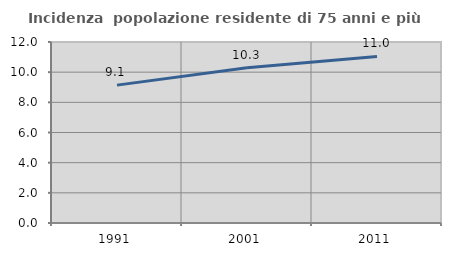
| Category | Incidenza  popolazione residente di 75 anni e più |
|---|---|
| 1991.0 | 9.141 |
| 2001.0 | 10.294 |
| 2011.0 | 11.044 |